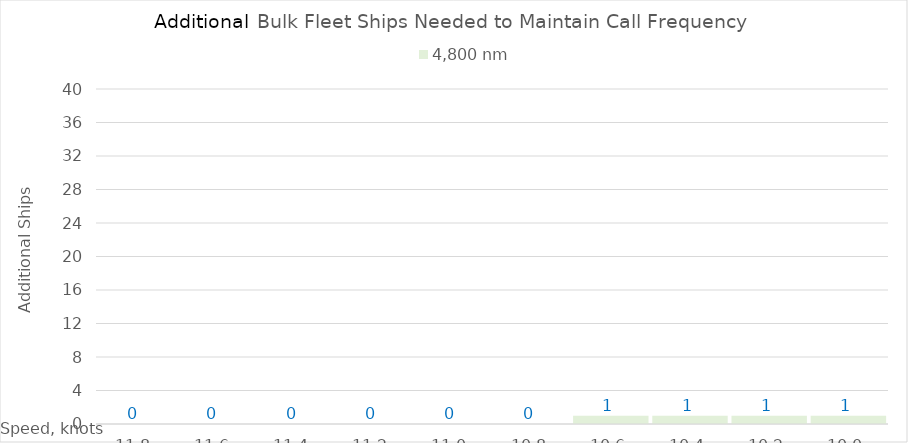
| Category | 4,800 |
|---|---|
| 11.8 | 0 |
| 11.600000000000001 | 0 |
| 11.400000000000002 | 0 |
| 11.200000000000003 | 0 |
| 11.000000000000004 | 0 |
| 10.800000000000004 | 0 |
| 10.600000000000005 | 1 |
| 10.400000000000006 | 1 |
| 10.200000000000006 | 1 |
| 10.000000000000007 | 1 |